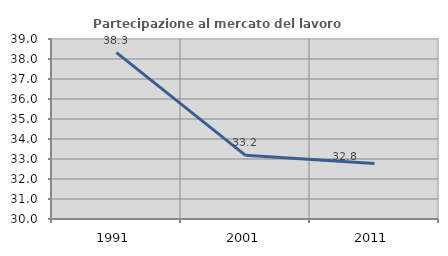
| Category | Partecipazione al mercato del lavoro  femminile |
|---|---|
| 1991.0 | 38.318 |
| 2001.0 | 33.184 |
| 2011.0 | 32.773 |